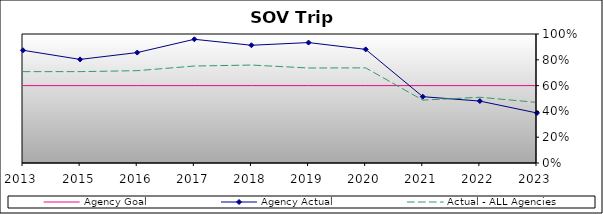
| Category | Agency Goal | Agency Actual | Actual - ALL Agencies |
|---|---|---|---|
| 2013.0 | 0.6 | 0.874 | 0.708 |
| 2015.0 | 0.6 | 0.803 | 0.708 |
| 2016.0 | 0.6 | 0.856 | 0.716 |
| 2017.0 | 0.6 | 0.959 | 0.752 |
| 2018.0 | 0.6 | 0.913 | 0.759 |
| 2019.0 | 0.6 | 0.934 | 0.736 |
| 2020.0 | 0.6 | 0.881 | 0.737 |
| 2021.0 | 0.6 | 0.514 | 0.487 |
| 2022.0 | 0.6 | 0.48 | 0.509 |
| 2023.0 | 0.6 | 0.388 | 0.47 |